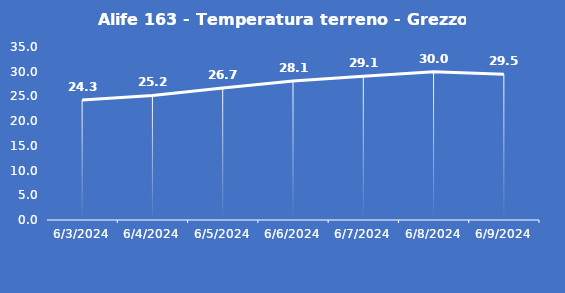
| Category | Alife 163 - Temperatura terreno - Grezzo (°C) |
|---|---|
| 6/3/24 | 24.3 |
| 6/4/24 | 25.2 |
| 6/5/24 | 26.7 |
| 6/6/24 | 28.1 |
| 6/7/24 | 29.1 |
| 6/8/24 | 30 |
| 6/9/24 | 29.5 |